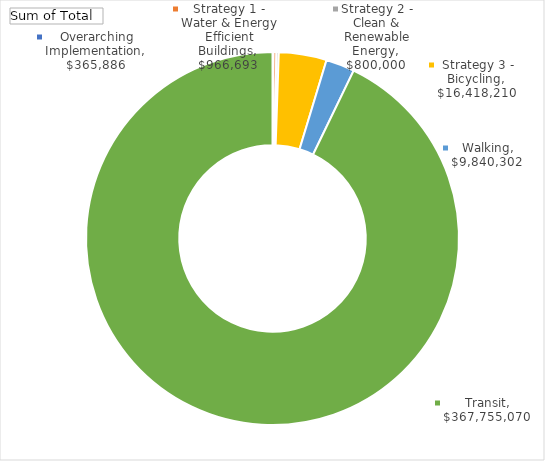
| Category | Total |
|---|---|
| Overarching Implementation | 365885.8 |
| Strategy 1 - Water & Energy Efficient Buildings | 966693 |
| Strategy 2 - Clean & Renewable Energy | 800000 |
| Strategy 3 - Bicycling, Walking, Transit, and Land Use | 16418209.8 |
| Strategy 4 - Zero Waste | 9840301.5 |
| Strategy 5 - Climate Resiliency | 367755069.8 |